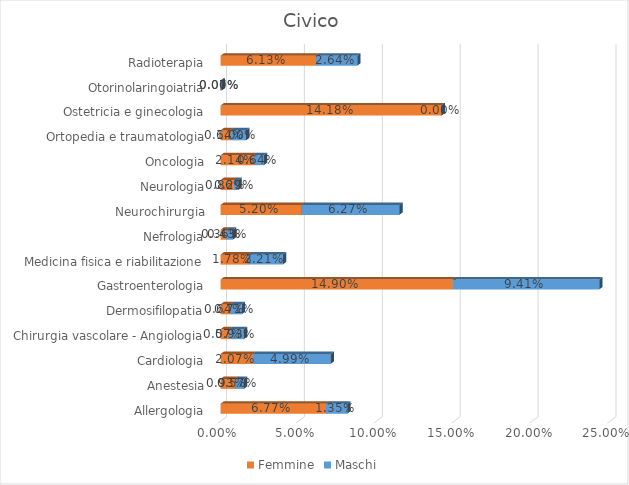
| Category | Femmine | Maschi |
|---|---|---|
| Allergologia | 0.068 | 0.014 |
| Anestesia | 0.009 | 0.006 |
| Cardiologia | 0.021 | 0.05 |
| Chirurgia vascolare - Angiologia | 0.006 | 0.009 |
| Dermosifilopatia | 0.006 | 0.007 |
| Gastroenterologia | 0.149 | 0.094 |
| Medicina fisica e riabilitazione | 0.018 | 0.022 |
| Nefrologia | 0.004 | 0.004 |
| Neurochirurgia | 0.052 | 0.063 |
| Neurologia | 0.009 | 0.003 |
| Oncologia | 0.021 | 0.006 |
| Ortopedia e traumatologia | 0.006 | 0.01 |
| Ostetricia e ginecologia | 0.142 | 0 |
| Otorinolaringoiatria | 0 | 0.001 |
| Radioterapia | 0.061 | 0.026 |